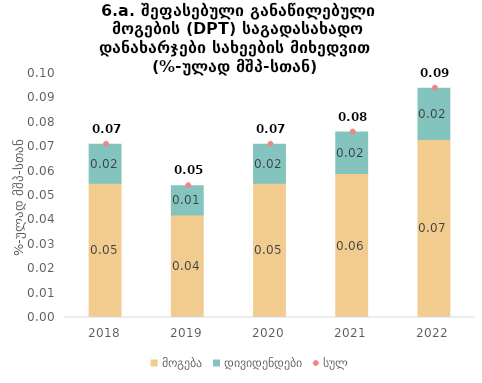
| Category | მოგება | დივიდენდები |
|---|---|---|
| 2018.0 | 0.055 | 0.016 |
| 2019.0 | 0.042 | 0.012 |
| 2020.0 | 0.055 | 0.016 |
| 2021.0 | 0.059 | 0.017 |
| 2022.0 | 0.073 | 0.021 |